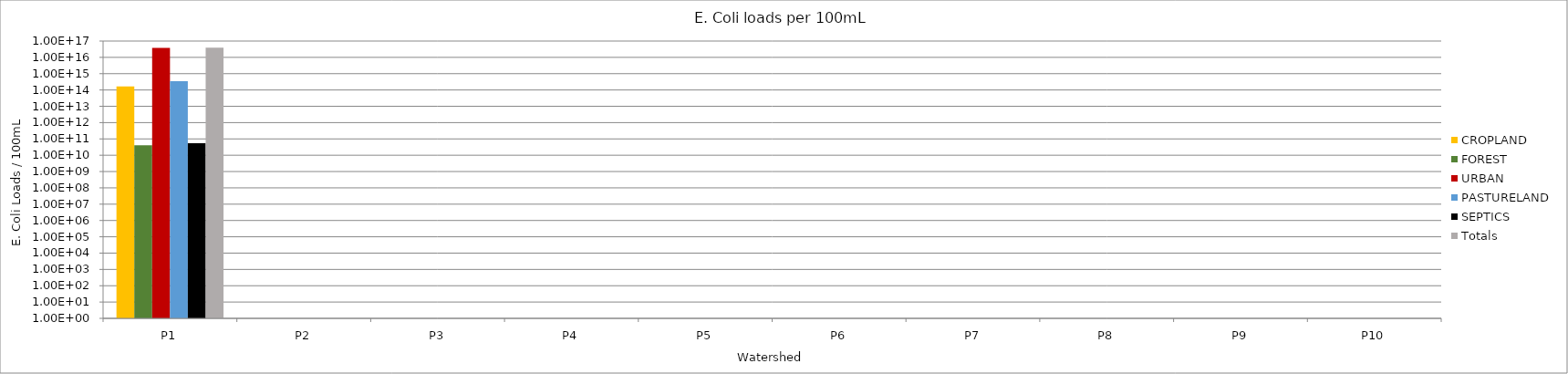
| Category | CROPLAND | FOREST | URBAN | PASTURELAND | SEPTICS | Totals |
|---|---|---|---|---|---|---|
| P1 | 162729340657142.03 | 40808040914.292 | 38537495128530312 | 345080679321751.6 | 54070117803.643 | 39045400026667920 |
| P2 | 0 | 0 | 0 | 0 | 0 | 0 |
| P3 | 0 | 0 | 0 | 0 | 0 | 0 |
| P4 | 0 | 0 | 0 | 0 | 0 | 0 |
| P5 | 0 | 0 | 0 | 0 | 0 | 0 |
| P6 | 0 | 0 | 0 | 0 | 0 | 0 |
| P7 | 0 | 0 | 0 | 0 | 0 | 0 |
| P8 | 0 | 0 | 0 | 0 | 0 | 0 |
| P9 | 0 | 0 | 0 | 0 | 0 | 0 |
| P10 | 0 | 0 | 0 | 0 | 0 | 0 |